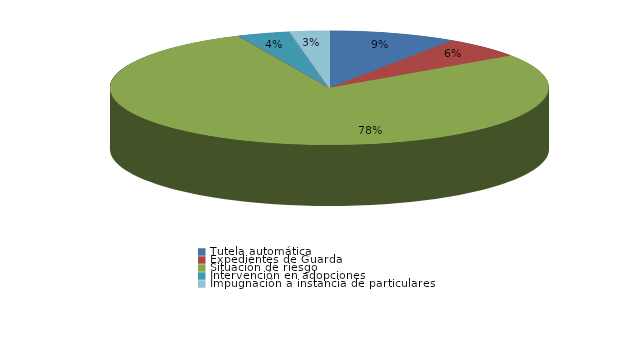
| Category | Series 0 |
|---|---|
| Tutela automática | 36 |
| Expedientes de Guarda | 23 |
| Situación de riesgo | 298 |
| Intervención en acogimientos | 0 |
| Intervención en adopciones | 15 |
| Defensa de los derechos fundamentales | 0 |
| Sustracción internacional de menores | 0 |
| Visitas a Centros | 0 |
| Ensayos Clínicos | 0 |
| Impugnación a instacia del Fiscal | 0 |
| Impugnación a instancia de particulares | 11 |